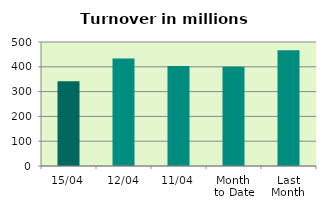
| Category | Series 0 |
|---|---|
| 15/04 | 341.625 |
| 12/04 | 433.786 |
| 11/04 | 403.709 |
| Month 
to Date | 400.672 |
| Last
Month | 466.511 |